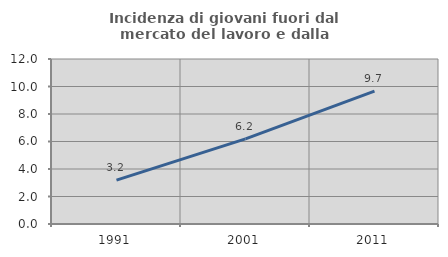
| Category | Incidenza di giovani fuori dal mercato del lavoro e dalla formazione  |
|---|---|
| 1991.0 | 3.187 |
| 2001.0 | 6.195 |
| 2011.0 | 9.659 |